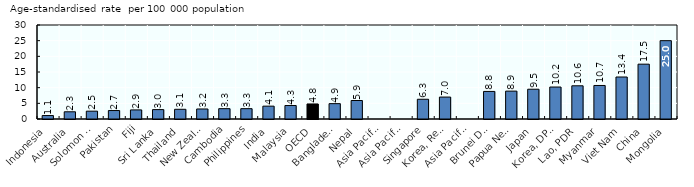
| Category | Total |
|---|---|
| Indonesia  | 1.1 |
| Australia | 2.3 |
| Solomon Islands | 2.5 |
| Pakistan | 2.7 |
| Fiji | 2.9 |
| Sri Lanka | 3 |
| Thailand | 3.1 |
| New Zealand  | 3.2 |
| Cambodia | 3.3 |
| Philippines | 3.3 |
| India | 4.1 |
| Malaysia | 4.3 |
| OECD | 4.8 |
| Bangladesh | 4.9 |
| Nepal | 5.9 |
| Asia Pacific-UM | 6.16 |
| Asia Pacific-H | 6.183 |
| Singapore | 6.3 |
| Korea, Rep. | 7 |
| Asia Pacific-LM/L | 7.614 |
| Brunei Darussalam | 8.8 |
| Papua New Guinea | 8.9 |
| Japan | 9.5 |
| Korea, DPR | 10.2 |
| Lao, PDR | 10.6 |
| Myanmar | 10.7 |
| Viet Nam | 13.4 |
| China | 17.5 |
| Mongolia | 25 |